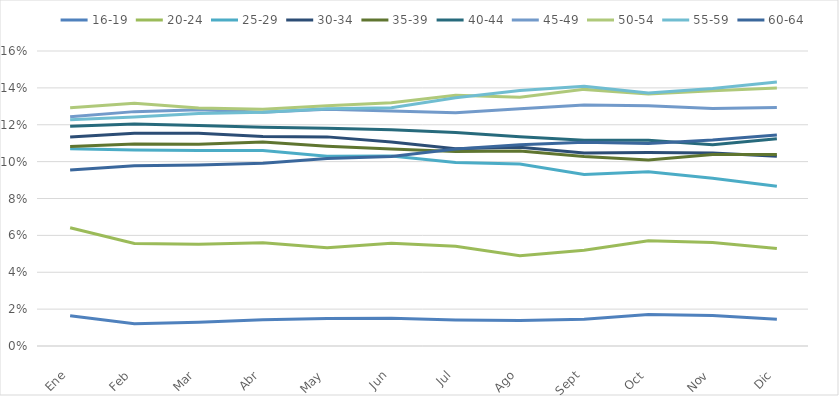
| Category | 16-19 | 20-24 | 25-29 | 30-34 | 35-39 | 40-44 | 45-49 | 50-54 | 55-59 | 60-64 |
|---|---|---|---|---|---|---|---|---|---|---|
| Ene | 0.016 | 0.064 | 0.107 | 0.113 | 0.108 | 0.119 | 0.124 | 0.129 | 0.123 | 0.095 |
| Feb | 0.012 | 0.056 | 0.106 | 0.115 | 0.11 | 0.12 | 0.127 | 0.132 | 0.124 | 0.098 |
| Mar | 0.013 | 0.055 | 0.106 | 0.115 | 0.109 | 0.12 | 0.128 | 0.129 | 0.126 | 0.098 |
| Abr | 0.014 | 0.056 | 0.106 | 0.114 | 0.111 | 0.119 | 0.127 | 0.128 | 0.127 | 0.099 |
| May | 0.015 | 0.053 | 0.103 | 0.113 | 0.108 | 0.118 | 0.128 | 0.13 | 0.129 | 0.102 |
| Jun | 0.015 | 0.056 | 0.103 | 0.111 | 0.107 | 0.117 | 0.127 | 0.132 | 0.129 | 0.103 |
| Jul | 0.014 | 0.054 | 0.099 | 0.107 | 0.106 | 0.116 | 0.127 | 0.136 | 0.135 | 0.107 |
| Ago | 0.014 | 0.049 | 0.099 | 0.108 | 0.106 | 0.114 | 0.129 | 0.135 | 0.139 | 0.109 |
| Sept | 0.015 | 0.052 | 0.093 | 0.105 | 0.103 | 0.112 | 0.131 | 0.139 | 0.141 | 0.111 |
| Oct | 0.017 | 0.057 | 0.095 | 0.105 | 0.101 | 0.112 | 0.13 | 0.137 | 0.137 | 0.11 |
| Nov | 0.017 | 0.056 | 0.091 | 0.105 | 0.104 | 0.109 | 0.129 | 0.138 | 0.14 | 0.112 |
| Dic | 0.014 | 0.053 | 0.087 | 0.103 | 0.104 | 0.112 | 0.129 | 0.14 | 0.143 | 0.114 |